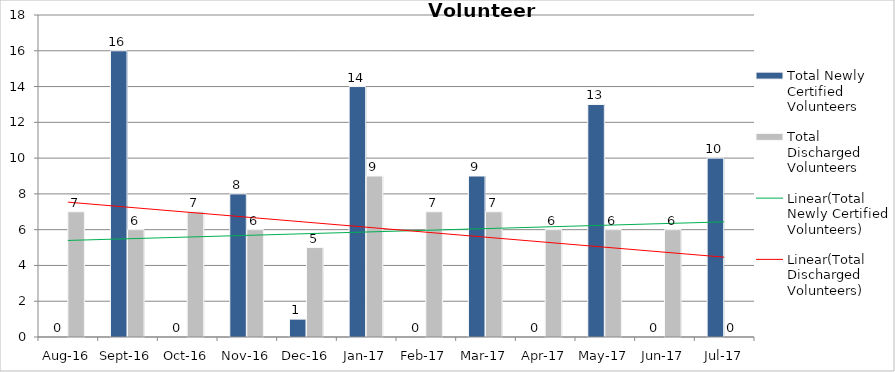
| Category | Total Newly Certified Volunteers | Total Discharged Volunteers |
|---|---|---|
| Aug-16 | 0 | 7 |
| Sep-16 | 16 | 6 |
| Oct-16 | 0 | 7 |
| Nov-16 | 8 | 6 |
| Dec-16 | 1 | 5 |
| Jan-17 | 14 | 9 |
| Feb-17 | 0 | 7 |
| Mar-17 | 9 | 7 |
| Apr-17 | 0 | 6 |
| May-17 | 13 | 6 |
| Jun-17 | 0 | 6 |
| Jul-17 | 10 | 0 |